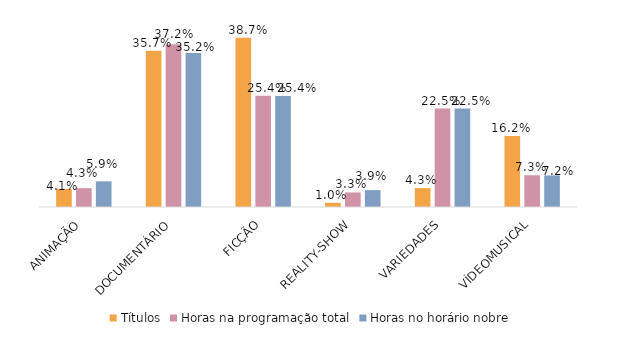
| Category | Títulos | Horas na programação total | Horas no horário nobre |
|---|---|---|---|
| ANIMAÇÃO | 0.041 | 0.043 | 0.059 |
| DOCUMENTÁRIO | 0.357 | 0.372 | 0.352 |
| FICÇÃO | 0.387 | 0.254 | 0.254 |
| REALITY-SHOW | 0.01 | 0.033 | 0.039 |
| VARIEDADES | 0.043 | 0.225 | 0.225 |
| VÍDEOMUSICAL | 0.162 | 0.073 | 0.072 |